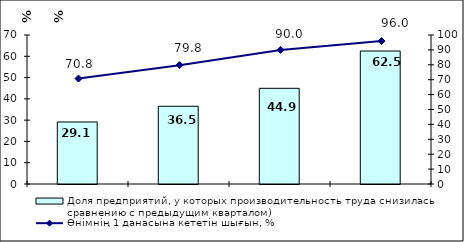
| Category | Доля предприятий, у которых производительность труда снизилась (по сравнению с предыдущим кварталом) |
|---|---|
| 0 | 29.149 |
| 1 | 36.508 |
| 2 | 44.949 |
| 3 | 62.482 |